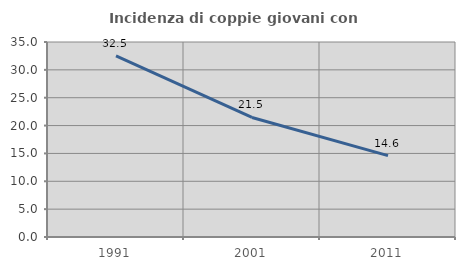
| Category | Incidenza di coppie giovani con figli |
|---|---|
| 1991.0 | 32.496 |
| 2001.0 | 21.454 |
| 2011.0 | 14.602 |